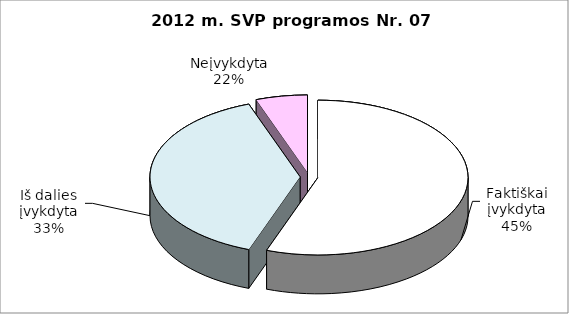
| Category | Series 0 |
|---|---|
| 0 | 10 |
| 1 | 7 |
| 2 | 1 |